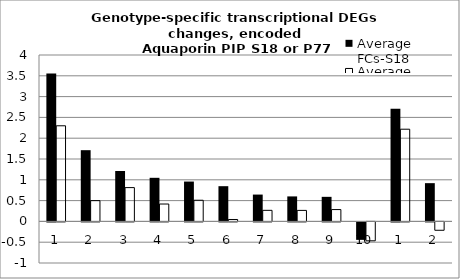
| Category | Average FCs-S18 | Average FCs-P77 |
|---|---|---|
| 1.0 | 3.557 | 2.298 |
| 2.0 | 1.712 | 0.5 |
| 3.0 | 1.212 | 0.812 |
| 4.0 | 1.048 | 0.418 |
| 5.0 | 0.958 | 0.509 |
| 6.0 | 0.846 | 0.046 |
| 7.0 | 0.645 | 0.266 |
| 8.0 | 0.601 | 0.265 |
| 9.0 | 0.59 | 0.284 |
| 10.0 | -0.42 | -0.455 |
| 1.0 | 2.708 | 2.216 |
| 2.0 | 0.919 | -0.201 |